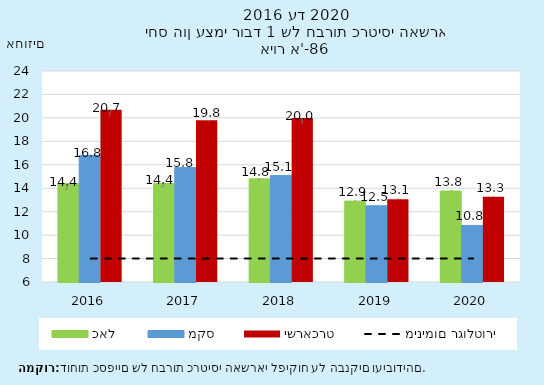
| Category | כאל  | מקס | ישראכרט |
|---|---|---|---|
| 2016 | 14.4 | 16.8 | 20.7 |
| 2017 | 14.4 | 15.76 | 19.8 |
| 2018 | 14.8 | 15.079 | 20 |
| 2019 | 12.904 | 12.502 | 13.062 |
| 2020 | 13.764 | 10.824 | 13.262 |